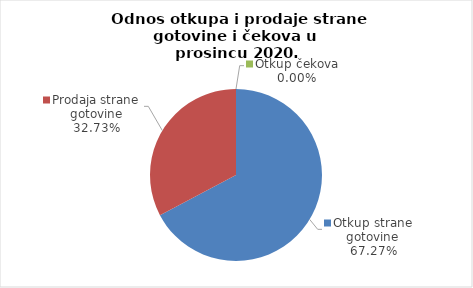
| Category | Series 0 |
|---|---|
| Otkup strane gotovine | 67.272 |
| Prodaja strane gotovine | 32.728 |
| Otkup čekova | 0 |